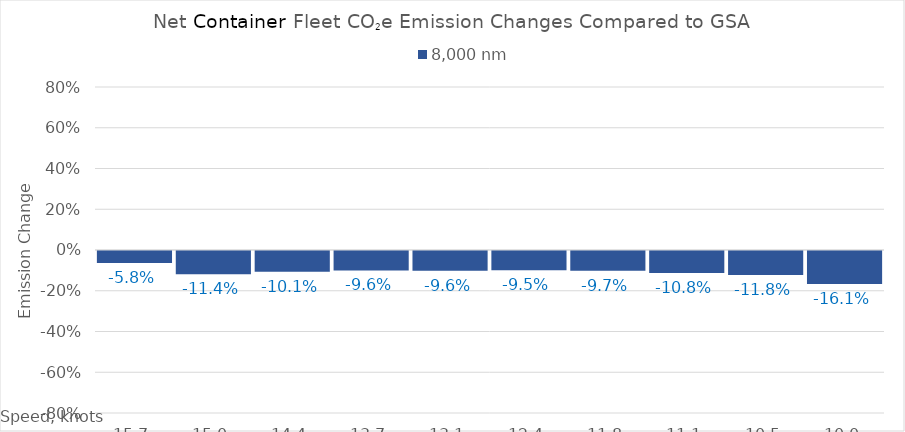
| Category | 8,000 |
|---|---|
| 15.65 | -0.058 |
| 15.0 | -0.114 |
| 14.35 | -0.101 |
| 13.7 | -0.096 |
| 13.049999999999999 | -0.096 |
| 12.399999999999999 | -0.095 |
| 11.749999999999998 | -0.097 |
| 11.099999999999998 | -0.108 |
| 10.449999999999998 | -0.118 |
| 10.0 | -0.161 |